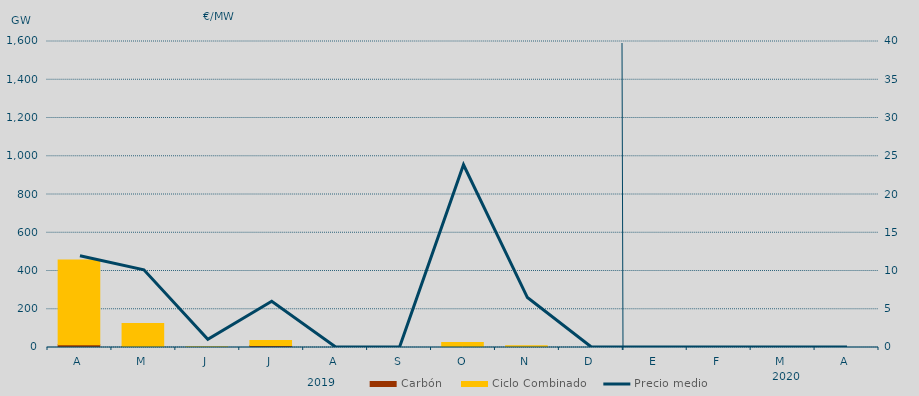
| Category | Carbón | Ciclo Combinado |
|---|---|---|
| A | 14816 | 442359.9 |
| M | 5017.5 | 120808.3 |
| J | 0 | 4200 |
| J | 10582.1 | 26246.2 |
| A | 0 | 0 |
| S | 0 | 0 |
| O | 0 | 25712.6 |
| N | 0 | 8552.1 |
| D | 0 | 0 |
| E | 0 | 0 |
| F | 0 | 0 |
| M | 0 | 0 |
| A | 0 | 0 |